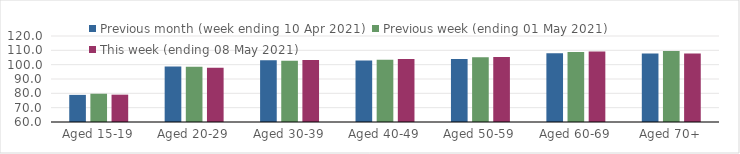
| Category | Previous month (week ending 10 Apr 2021) | Previous week (ending 01 May 2021) | This week (ending 08 May 2021) |
|---|---|---|---|
| Aged 15-19 | 78.92 | 79.72 | 79.07 |
| Aged 20-29 | 98.79 | 98.52 | 97.92 |
| Aged 30-39 | 103.11 | 102.76 | 103.22 |
| Aged 40-49 | 102.95 | 103.49 | 104.03 |
| Aged 50-59 | 104.02 | 105.13 | 105.4 |
| Aged 60-69 | 107.96 | 108.83 | 109.1 |
| Aged 70+ | 107.85 | 109.51 | 107.78 |